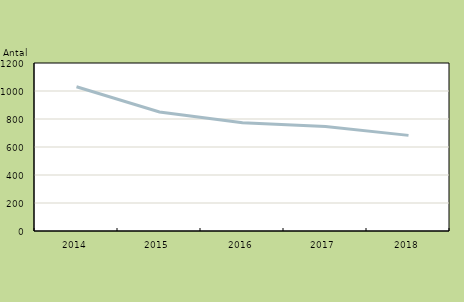
| Category | Medgivandeutredningar |
|---|---|
| 2014.0 | 1030 |
| 2015.0 | 850 |
| 2016.0 | 774 |
| 2017.0 | 747 |
| 2018.0 | 683 |